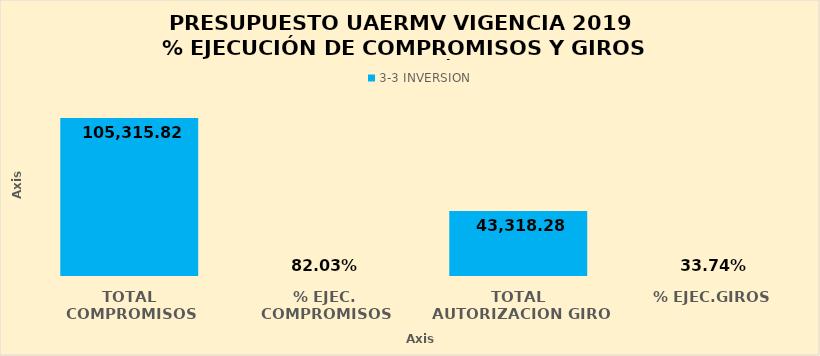
| Category | #REF! | 3-3 |
|---|---|---|
| TOTAL COMPROMISOS |  | 105315.824 |
| % EJEC. COMPROMISOS |  | 0.82 |
| TOTAL AUTORIZACION GIRO |  | 43318.283 |
| % EJEC.GIROS |  | 0.337 |